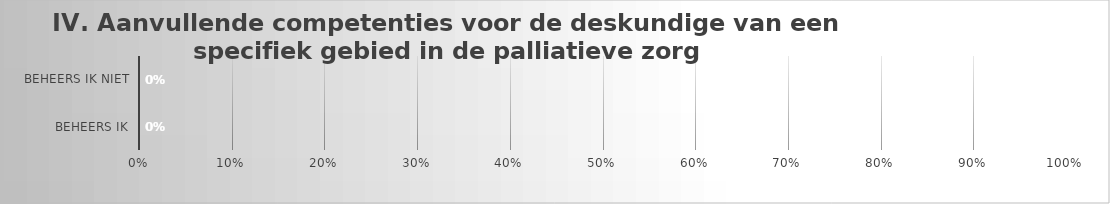
| Category | Competenties op deskundigheid van een specifiek gebied in de palliatieve zorg |
|---|---|
| Beheers ik | 0 |
| Beheers ik niet | 0 |